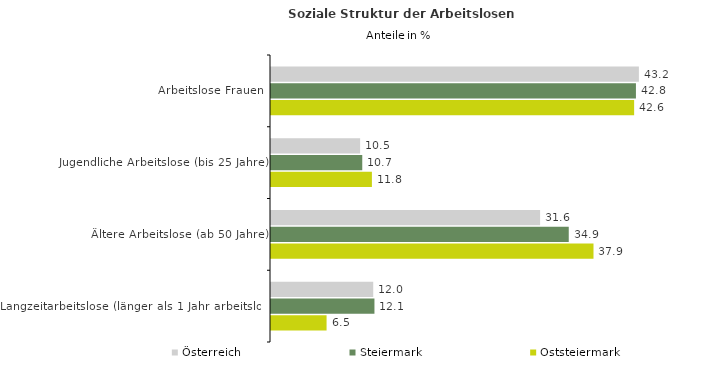
| Category | Österreich | Steiermark | Oststeiermark |
|---|---|---|---|
| Arbeitslose Frauen | 43.18 | 42.833 | 42.621 |
| Jugendliche Arbeitslose (bis 25 Jahre) | 10.46 | 10.711 | 11.843 |
| Ältere Arbeitslose (ab 50 Jahre) | 31.584 | 34.947 | 37.852 |
| Langzeitarbeitslose (länger als 1 Jahr arbeitslos) | 11.999 | 12.142 | 6.523 |